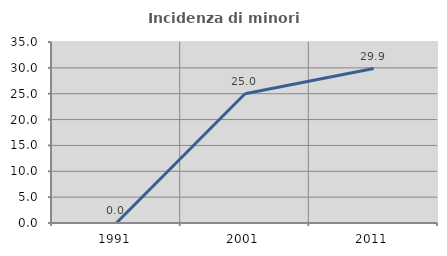
| Category | Incidenza di minori stranieri |
|---|---|
| 1991.0 | 0 |
| 2001.0 | 25 |
| 2011.0 | 29.861 |